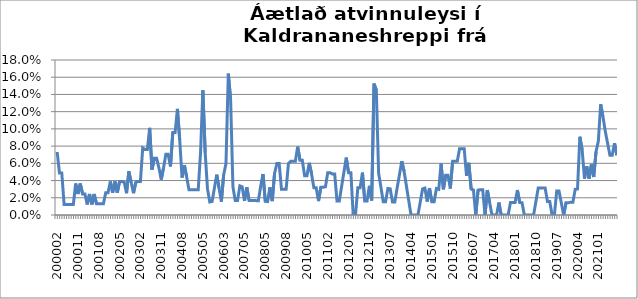
| Category | Series 0 |
|---|---|
| 200002 | 0.073 |
| 200003 | 0.049 |
| 200004 | 0.049 |
| 200005 | 0.012 |
| 200006 | 0.012 |
| 200007 | 0.012 |
| 200008 | 0.012 |
| 200009 | 0.012 |
| 200010 | 0.037 |
| 200011 | 0.024 |
| 200012 | 0.037 |
| 200101 | 0.024 |
| 200102 | 0.024 |
| 200103 | 0.012 |
| 200104 | 0.024 |
| 200105 | 0.012 |
| 200106 | 0.024 |
| 200107 | 0.013 |
| 200108 | 0.013 |
| 200109 | 0.013 |
| 200110 | 0.013 |
| 200111 | 0.026 |
| 200112 | 0.026 |
| 200201 | 0.039 |
| 200202 | 0.026 |
| 200203 | 0.039 |
| 200204 | 0.026 |
| 200205 | 0.039 |
| 200206 | 0.039 |
| 200207 | 0.038 |
| 200208 | 0.025 |
| 200209 | 0.051 |
| 200210 | 0.038 |
| 200211 | 0.025 |
| 200212 | 0.038 |
| 200301 | 0.039 |
| 200302 | 0.039 |
| 200303 | 0.078 |
| 200304 | 0.076 |
| 200305 | 0.076 |
| 200306 | 0.101 |
| 200307 | 0.053 |
| 200308 | 0.066 |
| 200309 | 0.066 |
| 200310 | 0.055 |
| 200311 | 0.041 |
| 200312 | 0.055 |
| 200401 | 0.07 |
| 200402 | 0.07 |
| 200403 | 0.056 |
| 200404 | 0.096 |
| 200405 | 0.096 |
| 200406 | 0.123 |
| 200407 | 0.087 |
| 200408 | 0.043 |
| 200409 | 0.058 |
| 200410 | 0.044 |
| 200411 | 0.029 |
| 200412 | 0.029 |
| 200501 | 0.029 |
| 200502 | 0.029 |
| 200503 | 0.029 |
| 200504 | 0.072 |
| 200505 | 0.145 |
| 200506 | 0.072 |
| 200508 | 0.03 |
| 200509 | 0.015 |
| 200510 | 0.016 |
| 200511 | 0.031 |
| 200512 | 0.047 |
| 200601 | 0.031 |
| 200602 | 0.016 |
| 200603 | 0.047 |
| 200604 | 0.06 |
| 200605 | 0.164 |
| 200606 | 0.134 |
| 200609 | 0.033 |
| 200610 | 0.017 |
| 200702 | 0.017 |
| 200703 | 0.034 |
| 200704 | 0.033 |
| 200705 | 0.016 |
| 200709 | 0.032 |
| 200710 | 0.017 |
| 200711 | 0.017 |
| 200712 | 0.017 |
| 200801 | 0.017 |
| 200802 | 0.017 |
| 200803 | 0.033 |
| 200804 | 0.048 |
| 200805 | 0.016 |
| 200812 | 0.016 |
| 200901 | 0.032 |
| 200902 | 0.016 |
| 200903 | 0.048 |
| 200904 | 0.06 |
| 200905 | 0.06 |
| 200906 | 0.03 |
| 200907 | 0.03 |
| 200908 | 0.03 |
| 200909 | 0.06 |
| 200910 | 0.062 |
| 200911 | 0.062 |
| 200912 | 0.062 |
| 201001 | 0.079 |
| 201002 | 0.063 |
| 201003 | 0.063 |
| 201004 | 0.045 |
| 201005 | 0.045 |
| 201006 | 0.061 |
| 201007 | 0.048 |
| 201008 | 0.032 |
| 201009 | 0.032 |
| 201010 | 0.016 |
| 201011 | 0.032 |
| 201012 | 0.032 |
| 201101 | 0.033 |
| 201102 | 0.049 |
| 201103 | 0.049 |
| 201104 | 0.048 |
| 201105 | 0.048 |
| 201108 | 0.016 |
| 201109 | 0.016 |
| 201110 | 0.033 |
| 201111 | 0.05 |
| 201112 | 0.067 |
| 201201 | 0.049 |
| 201202 | 0.049 |
| 201203 | 0 |
| 201204 | 0 |
| 201205 | 0.032 |
| 201206 | 0.032 |
| 201207 | 0.049 |
| 201208 | 0.016 |
| 201209 | 0.016 |
| 201210 | 0.034 |
| 201211 | 0.017 |
| 201212 | 0.153 |
| 201301 | 0.145 |
| 201302 | 0.048 |
| 201303 | 0.032 |
| 201304 | 0.015 |
| 201305 | 0.015 |
| 201306 | 0.031 |
| 201307 | 0.03 |
| 201308 | 0.015 |
| 201309 | 0.015 |
| 201310 | 0.031 |
| 201311 | 0.047 |
| 201312 | 0.062 |
| 201401 | 0.051 |
| 201402 | 0.034 |
| 201403 | 0.017 |
| 201404 | 0 |
| 201405 | 0 |
| 201406 | 0 |
| 201407 | 0 |
| 201408 | 0.015 |
| 201409 | 0.03 |
| 201410 | 0.031 |
| 201411 | 0.016 |
| 201412 | 0.031 |
| 201501 | 0.015 |
| 201502 | 0.015 |
| 201503 | 0.031 |
| 201504 | 0.03 |
| 201505 | 0.06 |
| 201506 | 0.03 |
| 201507 | 0.046 |
| 201508 | 0.046 |
| 201509 | 0.031 |
| 201510 | 0.062 |
| 201511 | 0.062 |
| 201512 | 0.062 |
| 201601 | 0.077 |
| 201602 | 0.077 |
| 201603 | 0.077 |
| 201604 | 0.045 |
| 201605 | 0.061 |
| 201606 | 0.03 |
| 201607 | 0.029 |
| 201608 | 0 |
| 201609 | 0.029 |
| 201610 | 0.029 |
| 201611 | 0.029 |
| 201612 | 0 |
| 201701 | 0.029 |
| 201702 | 0.014 |
| 201703 | 0 |
| 201704 | 0 |
| 201705 | 0 |
| 201706 | 0.014 |
| 201707 | 0 |
| 201708 | 0 |
| 201709 | 0 |
| 201710 | 0 |
| 201711 | 0.014 |
| 201712 | 0.014 |
| 201801 | 0.014 |
| 201802 | 0.029 |
| 201803 | 0.014 |
| 201804 | 0.014 |
| 201805 | 0 |
| 201806 | 0 |
| 201807 | 0 |
| 201808 | 0 |
| 201809 | 0 |
| 201810 | 0.016 |
| 201811 | 0.031 |
| 201812 | 0.031 |
| 201901 | 0.031 |
| 201902 | 0.031 |
| 201903 | 0.016 |
| 201904 | 0.016 |
| 201905 | 0 |
| 201906 | 0 |
| 201907 | 0.028 |
| 201908 | 0.028 |
| 201909 | 0.014 |
| 201910 | 0 |
| 201911 | 0.014 |
| 201912 | 0.014 |
| 202001 | 0.015 |
| 202002 | 0.015 |
| 202003 | 0.03 |
| 202004 | 0.03 |
| 202005 | 0.091 |
| 202006 | 0.076 |
| 202007 | 0.042 |
| 202008 | 0.056 |
| 202009 | 0.042 |
| 202010 | 0.059 |
| 202011 | 0.044 |
| 202012 | 0.074 |
| 202101 | 0.086 |
| 202102 | 0.129 |
| 202103 | 0.114 |
| 202104 | 0.097 |
| 202105 | 0.083 |
| 202106 | 0.069 |
| 202107 | 0.069 |
| 202108 | 0.083 |
| 202109 | 0.069 |